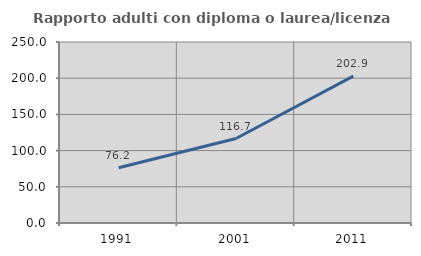
| Category | Rapporto adulti con diploma o laurea/licenza media  |
|---|---|
| 1991.0 | 76.225 |
| 2001.0 | 116.698 |
| 2011.0 | 202.941 |